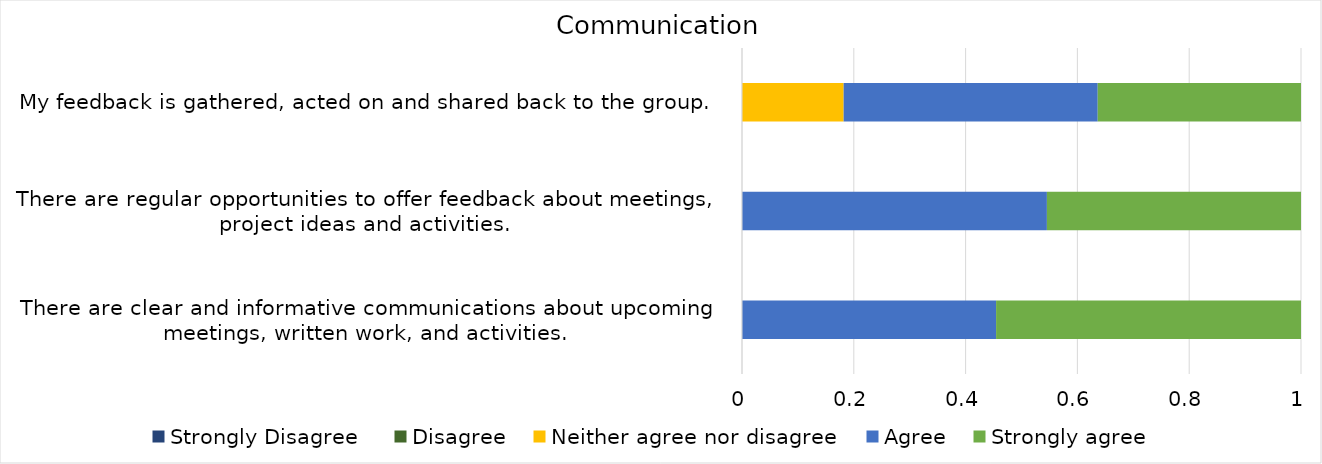
| Category | Strongly Disagree 
 | Disagree
 | Neither agree nor disagree
 | Agree
 | Strongly agree
 |
|---|---|---|---|---|---|
| There are clear and informative communications about upcoming meetings, written work, and activities. 

 | 0 | 0 | 0 | 5 | 6 |
| There are regular opportunities to offer feedback about meetings, project ideas and activities. 
 | 0 | 0 | 0 | 6 | 5 |
| My feedback is gathered, acted on and shared back to the group. 
 | 0 | 0 | 2 | 5 | 4 |